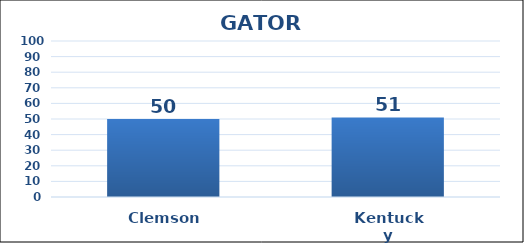
| Category | Series 0 |
|---|---|
| Clemson | 50 |
| Kentucky | 51 |